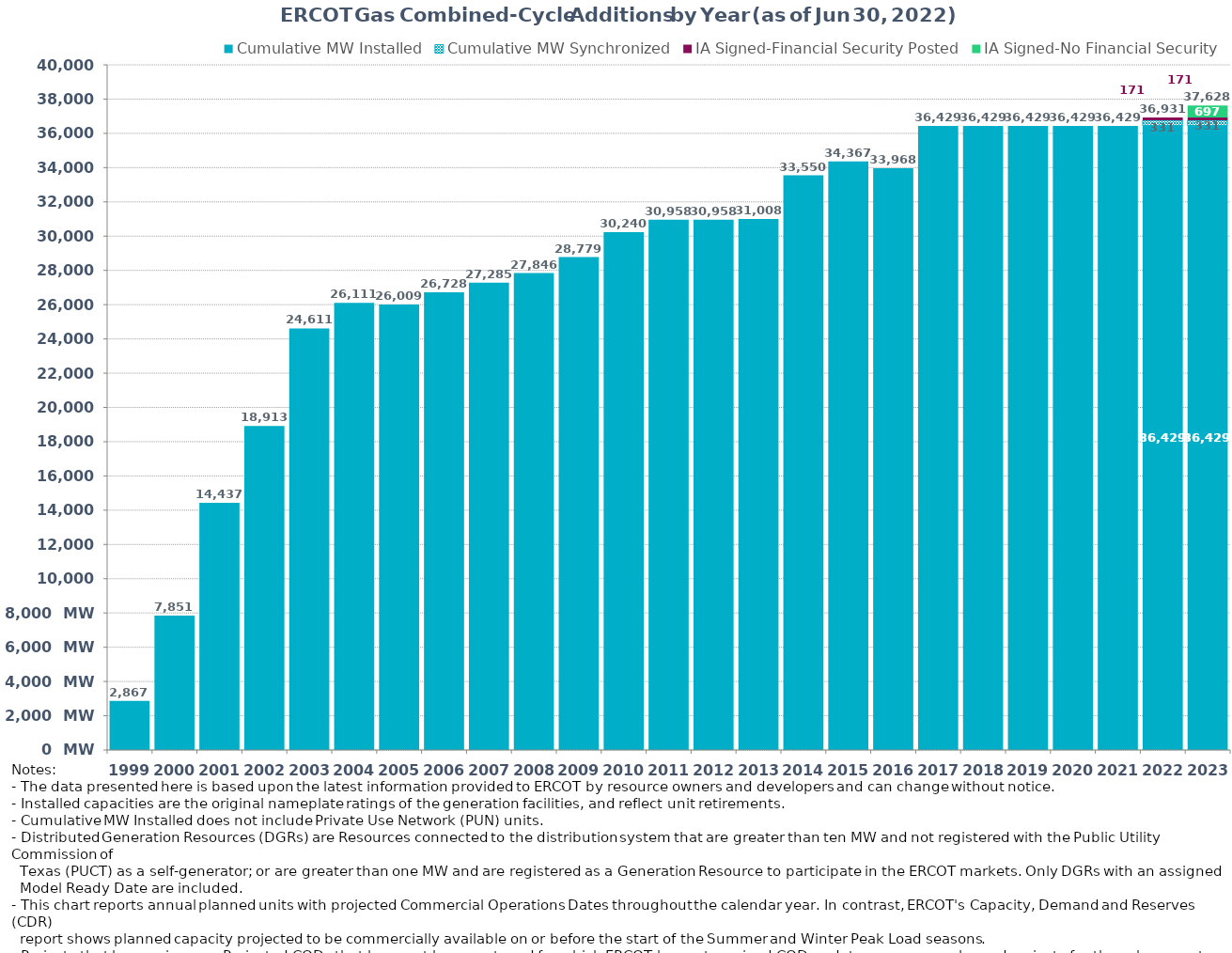
| Category | Cumulative MW Installed | Cumulative MW Synchronized | IA Signed-Financial Security Posted  | IA Signed-No Financial Security  | Other Planned | Cumulative Installed and Planned |
|---|---|---|---|---|---|---|
| 1999.0 | 2867 | 0 | 0 | 0 | 0 | 2867 |
| 2000.0 | 7851 | 0 | 0 | 0 | 0 | 7851 |
| 2001.0 | 14437 | 0 | 0 | 0 | 0 | 14437 |
| 2002.0 | 18913 | 0 | 0 | 0 | 0 | 18913 |
| 2003.0 | 24611 | 0 | 0 | 0 | 0 | 24611 |
| 2004.0 | 26111 | 0 | 0 | 0 | 0 | 26111 |
| 2005.0 | 26009 | 0 | 0 | 0 | 0 | 26009 |
| 2006.0 | 26728 | 0 | 0 | 0 | 0 | 26728 |
| 2007.0 | 27285 | 0 | 0 | 0 | 0 | 27285 |
| 2008.0 | 27846 | 0 | 0 | 0 | 0 | 27846 |
| 2009.0 | 28779 | 0 | 0 | 0 | 0 | 28779 |
| 2010.0 | 30240 | 0 | 0 | 0 | 0 | 30240 |
| 2011.0 | 30958 | 0 | 0 | 0 | 0 | 30958 |
| 2012.0 | 30958 | 0 | 0 | 0 | 0 | 30958 |
| 2013.0 | 31008 | 0 | 0 | 0 | 0 | 31008 |
| 2014.0 | 33550 | 0 | 0 | 0 | 0 | 33550 |
| 2015.0 | 34367 | 0 | 0 | 0 | 0 | 34367 |
| 2016.0 | 33968 | 0 | 0 | 0 | 0 | 33968 |
| 2017.0 | 36429 | 0 | 0 | 0 | 0 | 36429 |
| 2018.0 | 36429 | 0 | 0 | 0 | 0 | 36429 |
| 2019.0 | 36429 | 0 | 0 | 0 | 0 | 36429 |
| 2020.0 | 36429 | 0 | 0 | 0 | 0 | 36429 |
| 2021.0 | 36429 | 0 | 0 | 0 | 0 | 36429 |
| 2022.0 | 36429 | 331 | 171 | 0 | 0 | 36931 |
| 2023.0 | 36429 | 331 | 171 | 697 | 0 | 37628 |